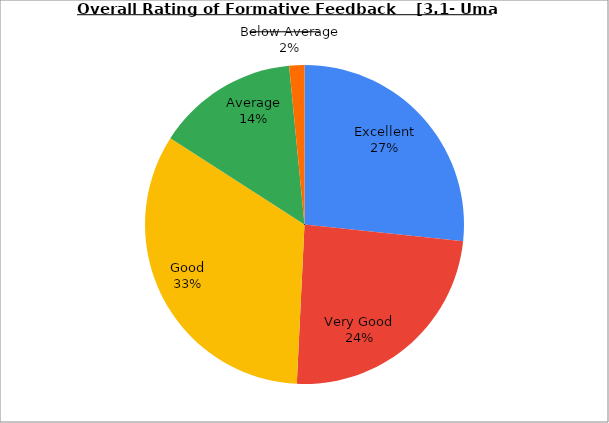
| Category | Series 0 |
|---|---|
| Excellent | 26.667 |
| Very Good | 24.103 |
| Good | 33.333 |
| Average | 14.359 |
| Below Average | 1.538 |